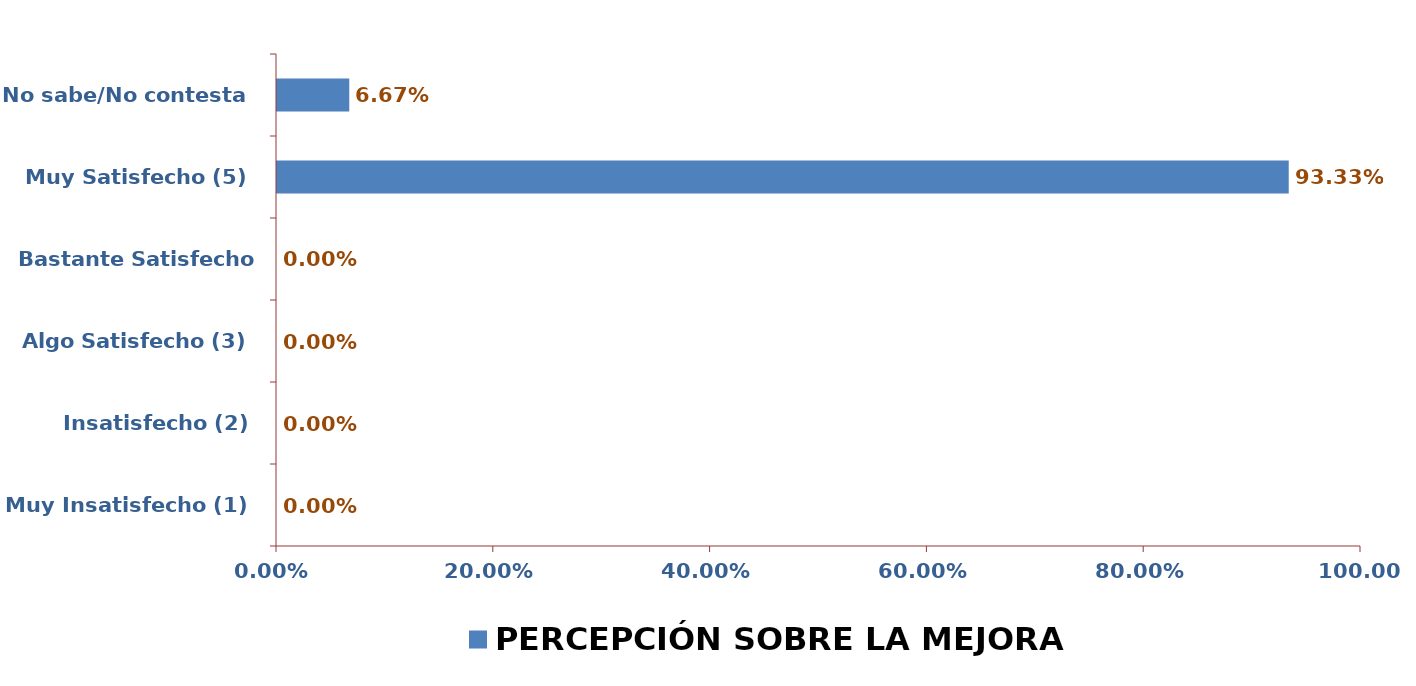
| Category | PERCEPCIÓN SOBRE LA MEJORA |
|---|---|
| Muy Insatisfecho (1) | 0 |
| Insatisfecho (2) | 0 |
| Algo Satisfecho (3) | 0 |
| Bastante Satisfecho (4) | 0 |
| Muy Satisfecho (5) | 0.933 |
| No sabe/No contesta | 0.067 |